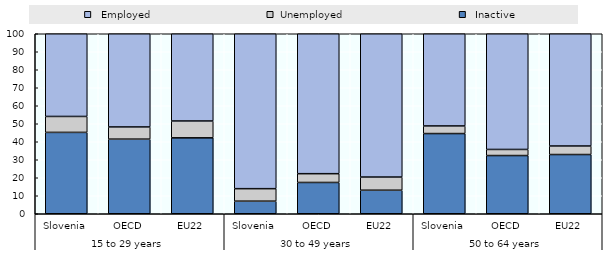
| Category |   Inactive |  Unemployed |   Employed |
|---|---|---|---|
| 0 | 45.207 | 8.855 | 45.938 |
| 1 | 41.452 | 6.771 | 51.776 |
| 2 | 42.173 | 9.37 | 48.457 |
| 3 | 6.995 | 6.945 | 86.06 |
| 4 | 17.386 | 4.874 | 77.74 |
| 5 | 13.076 | 7.319 | 79.605 |
| 6 | 44.551 | 4.228 | 51.221 |
| 7 | 32.343 | 3.381 | 64.276 |
| 8 | 32.901 | 4.746 | 62.353 |